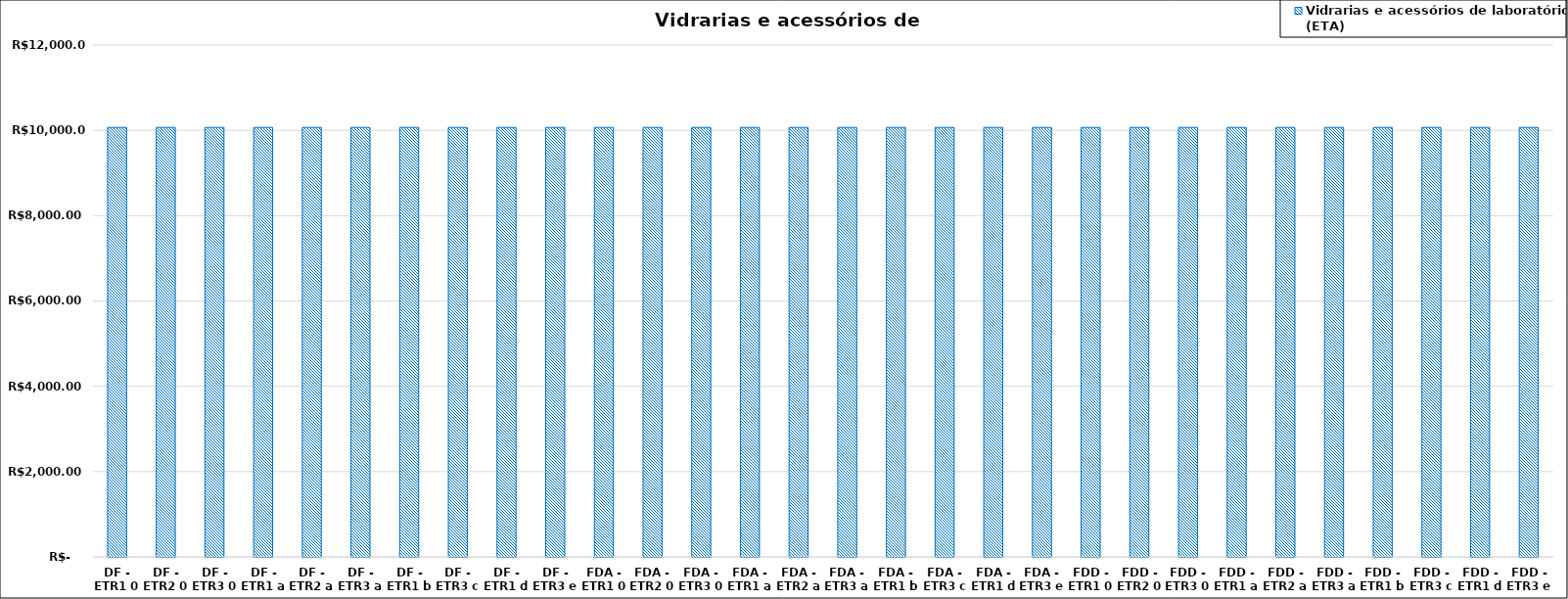
| Category | Vidrarias e acessórios de laboratório (ETA) |
|---|---|
| DF - ETR1 0 | 10067.74 |
| DF - ETR2 0 | 10067.74 |
| DF - ETR3 0 | 10067.74 |
| DF - ETR1 a | 10067.74 |
| DF - ETR2 a | 10067.74 |
| DF - ETR3 a | 10067.74 |
| DF - ETR1 b | 10067.74 |
| DF - ETR3 c | 10067.74 |
| DF - ETR1 d | 10067.74 |
| DF - ETR3 e | 10067.74 |
| FDA - ETR1 0 | 10067.74 |
| FDA - ETR2 0 | 10067.74 |
| FDA - ETR3 0 | 10067.74 |
| FDA - ETR1 a | 10067.74 |
| FDA - ETR2 a | 10067.74 |
| FDA - ETR3 a | 10067.74 |
| FDA - ETR1 b | 10067.74 |
| FDA - ETR3 c | 10067.74 |
| FDA - ETR1 d | 10067.74 |
| FDA - ETR3 e | 10067.74 |
| FDD - ETR1 0 | 10067.74 |
| FDD - ETR2 0 | 10067.74 |
| FDD - ETR3 0 | 10067.74 |
| FDD - ETR1 a | 10067.74 |
| FDD - ETR2 a | 10067.74 |
| FDD - ETR3 a | 10067.74 |
| FDD - ETR1 b | 10067.74 |
| FDD - ETR3 c | 10067.74 |
| FDD - ETR1 d | 10067.74 |
| FDD - ETR3 e | 10067.74 |